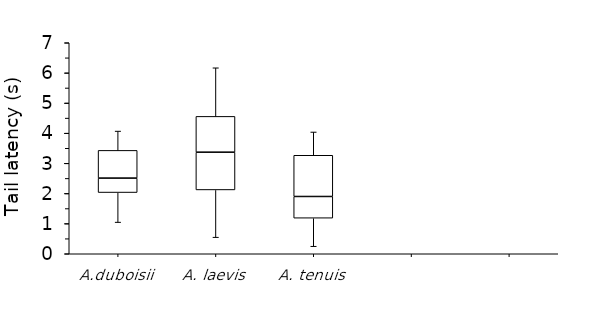
| Category | Series 0 | Series 1 | Series 2 |
|---|---|---|---|
| A.duboisii | 2.03 | 0.48 | 0.92 |
| A. laevis | 2.118 | 1.252 | 1.187 |
| A. tenuis | 1.18 | 0.72 | 1.368 |